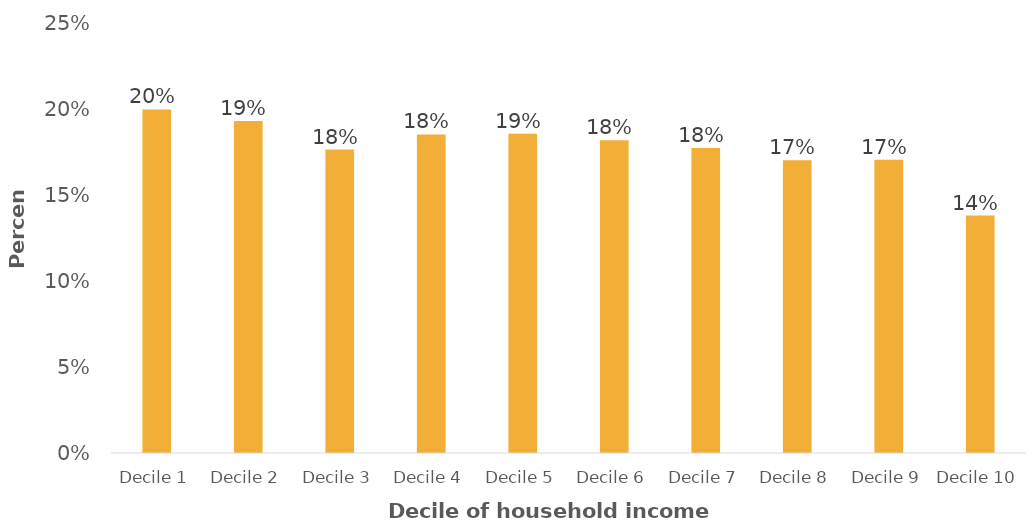
| Category | Series 0 |
|---|---|
| Decile 1 | 0.199 |
| Decile 2 | 0.193 |
| Decile 3 | 0.176 |
| Decile 4 | 0.185 |
| Decile 5 | 0.185 |
| Decile 6 | 0.181 |
| Decile 7 | 0.177 |
| Decile 8 | 0.17 |
| Decile 9 | 0.17 |
| Decile 10 | 0.138 |